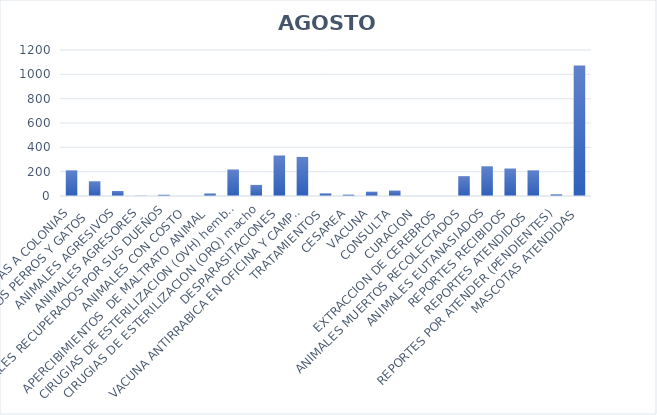
| Category | Series 0 |
|---|---|
| VISITAS A COLONIAS | 211 |
| ANIMALES CAPTURADOS PERROS Y GATOS  | 121 |
| ANIMALES AGRESIVOS | 41 |
| ANIMALES AGRESORES | 2 |
| ANIMALES RECUPERADOS POR SUS DUEÑOS | 10 |
| ANIMALES CON COSTO | 0 |
| APERCIBIMIENTOS  DE MALTRATO ANIMAL | 20 |
| CIRUGIAS DE ESTERILIZACION (OVH) hembra | 217 |
| CIRUGIAS DE ESTERILIZACION (ORQ) macho | 91 |
| DESPARASITACIONES | 332 |
| VACUNA ANTIRRABICA EN OFICINA Y CAMPAÑAS  | 321 |
| TRATAMIENTOS | 22 |
| CESAREA | 11 |
| VACUNA | 35 |
| CONSULTA | 44 |
| CURACION | 0 |
| EXTRACCION DE CEREBROS | 0 |
| ANIMALES MUERTOS RECOLECTADOS | 163 |
| ANIMALES EUTANASIADOS | 244 |
| REPORTES RECIBIDOS | 225 |
| REPORTES ATENDIDOS  | 211 |
| REPORTES POR ATENDER (PENDIENTES) | 14 |
| MASCOTAS ATENDIDAS | 1073 |